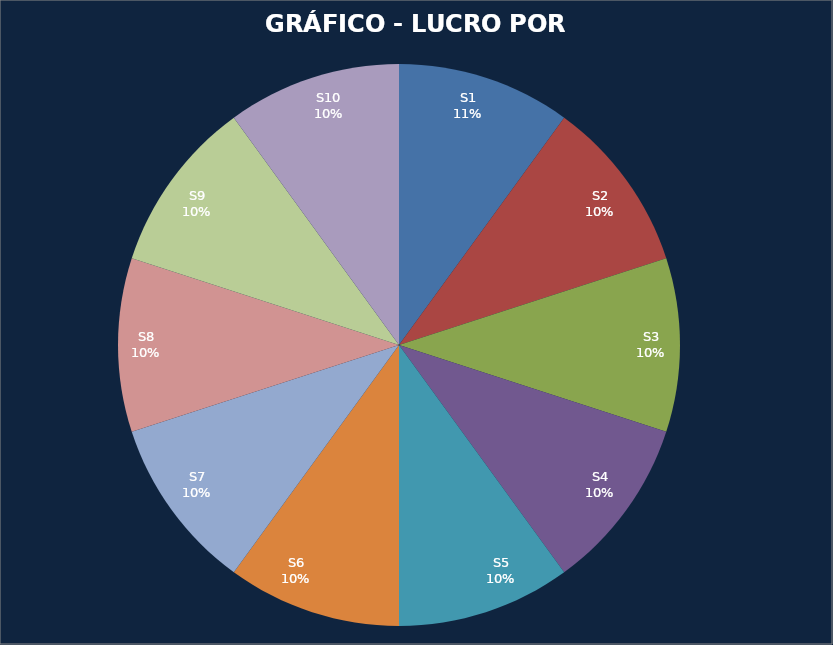
| Category | LUCRO |
|---|---|
| S1 | 0.01 |
| S2 | 0.01 |
| S3 | 0.01 |
| S4 | 0.01 |
| S5 | 0.01 |
| S6 | 0.01 |
| S7 | 0.01 |
| S8 | 0.01 |
| S9 | 0.01 |
| S10 | 0.01 |